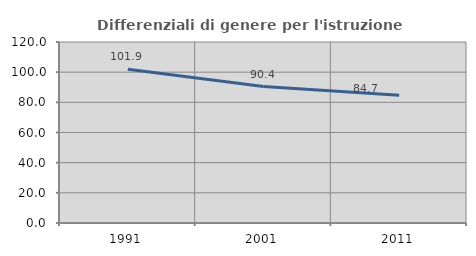
| Category | Differenziali di genere per l'istruzione superiore |
|---|---|
| 1991.0 | 101.864 |
| 2001.0 | 90.434 |
| 2011.0 | 84.653 |